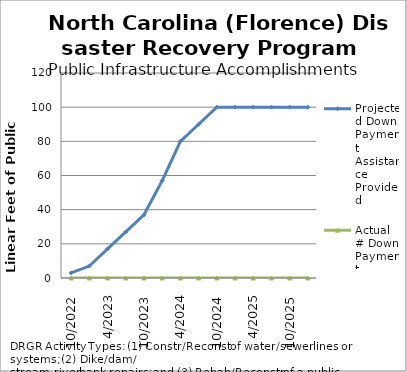
| Category | Projected Down Payment Assistance Provided | Actual # Down Payment Assistance Payments |
|---|---|---|
| 10/2022 | 3 | 0 |
| 1/2023 | 7 | 0 |
| 4/2023 | 17 | 0 |
| 7/2023 | 27 | 0 |
| 10/2023 | 37 | 0 |
| 1/2024 | 57 | 0 |
| 4/2024 | 80 | 0 |
| 7/2024 | 90 | 0 |
| 10/2024 | 100 | 0 |
| 1/2025 | 100 | 0 |
| 4/2025 | 100 | 0 |
| 7/2025 | 100 | 0 |
| 10/2025 | 100 | 0 |
| 1/2026 | 100 | 0 |